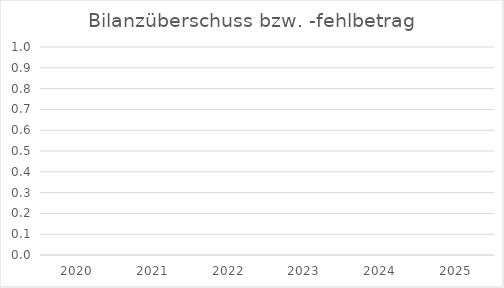
| Category | Series 0 |
|---|---|
| 2020.0 | 0 |
| 2021.0 | 0 |
| 2022.0 | 0 |
| 2023.0 | 0 |
| 2024.0 | 0 |
| 2025.0 | 0 |